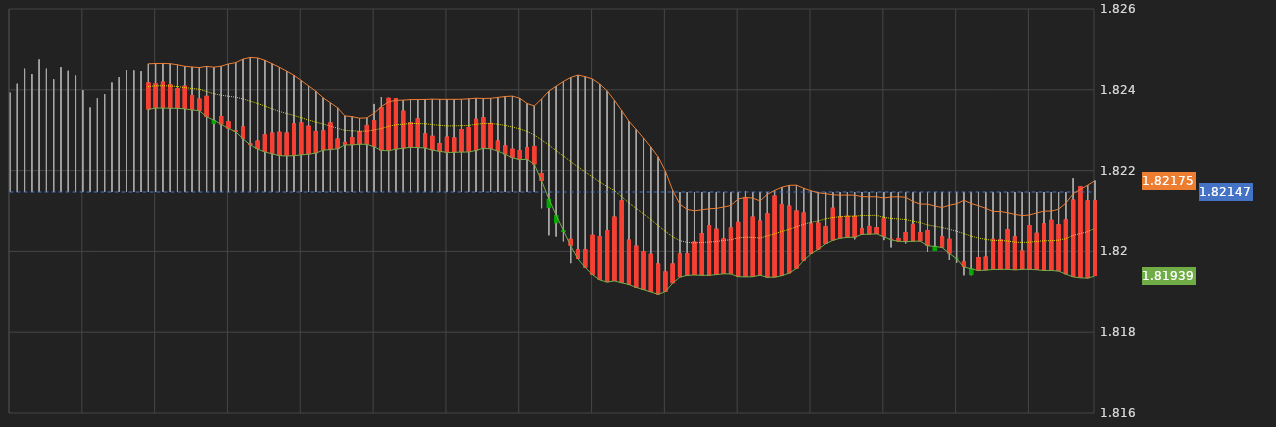
| Category | Series 0 | Series 1 | Series 2 | Series 3 |
|---|---|---|---|---|
| 18/09/2019 10:06:00 | 1.824 | 1.824 | 1.824 | 1.824 |
| 18/09/2019 10:07:00 | 1.824 | 1.824 | 1.824 | 1.824 |
| 18/09/2019 10:08:00 | 1.824 | 1.825 | 1.824 | 1.824 |
| 18/09/2019 10:09:00 | 1.824 | 1.824 | 1.824 | 1.824 |
| 18/09/2019 10:10:00 | 1.824 | 1.825 | 1.824 | 1.824 |
| 18/09/2019 10:11:00 | 1.824 | 1.825 | 1.824 | 1.824 |
| 18/09/2019 10:12:00 | 1.824 | 1.824 | 1.824 | 1.824 |
| 18/09/2019 10:13:00 | 1.824 | 1.825 | 1.824 | 1.824 |
| 18/09/2019 10:14:00 | 1.824 | 1.824 | 1.824 | 1.824 |
| 18/09/2019 10:15:00 | 1.824 | 1.824 | 1.824 | 1.824 |
| 18/09/2019 10:16:00 | 1.824 | 1.824 | 1.823 | 1.823 |
| 18/09/2019 10:17:00 | 1.823 | 1.824 | 1.823 | 1.824 |
| 18/09/2019 10:18:00 | 1.824 | 1.824 | 1.823 | 1.824 |
| 18/09/2019 10:19:00 | 1.824 | 1.824 | 1.823 | 1.824 |
| 18/09/2019 10:20:00 | 1.824 | 1.824 | 1.824 | 1.824 |
| 18/09/2019 10:21:00 | 1.824 | 1.824 | 1.824 | 1.824 |
| 18/09/2019 10:22:00 | 1.824 | 1.824 | 1.824 | 1.824 |
| 18/09/2019 10:23:00 | 1.824 | 1.824 | 1.824 | 1.824 |
| 18/09/2019 10:24:00 | 1.824 | 1.824 | 1.824 | 1.824 |
| 18/09/2019 10:25:00 | 1.824 | 1.824 | 1.824 | 1.824 |
| 18/09/2019 10:26:00 | 1.824 | 1.824 | 1.824 | 1.824 |
| 18/09/2019 10:27:00 | 1.824 | 1.824 | 1.824 | 1.824 |
| 18/09/2019 10:28:00 | 1.824 | 1.824 | 1.824 | 1.824 |
| 18/09/2019 10:29:00 | 1.824 | 1.824 | 1.824 | 1.824 |
| 18/09/2019 10:30:00 | 1.824 | 1.824 | 1.824 | 1.824 |
| 18/09/2019 10:31:00 | 1.824 | 1.824 | 1.824 | 1.824 |
| 18/09/2019 10:32:00 | 1.824 | 1.824 | 1.824 | 1.824 |
| 18/09/2019 10:33:00 | 1.824 | 1.824 | 1.823 | 1.823 |
| 18/09/2019 10:34:00 | 1.823 | 1.823 | 1.823 | 1.823 |
| 18/09/2019 10:35:00 | 1.823 | 1.823 | 1.823 | 1.823 |
| 18/09/2019 10:36:00 | 1.823 | 1.823 | 1.823 | 1.823 |
| 18/09/2019 10:37:00 | 1.823 | 1.823 | 1.823 | 1.823 |
| 18/09/2019 10:38:00 | 1.823 | 1.823 | 1.823 | 1.823 |
| 18/09/2019 10:39:00 | 1.823 | 1.823 | 1.823 | 1.823 |
| 18/09/2019 10:40:00 | 1.823 | 1.823 | 1.823 | 1.823 |
| 18/09/2019 10:41:00 | 1.823 | 1.823 | 1.823 | 1.823 |
| 18/09/2019 10:42:00 | 1.823 | 1.823 | 1.823 | 1.823 |
| 18/09/2019 10:43:00 | 1.823 | 1.823 | 1.823 | 1.823 |
| 18/09/2019 10:44:00 | 1.823 | 1.823 | 1.823 | 1.823 |
| 18/09/2019 10:45:00 | 1.823 | 1.823 | 1.823 | 1.823 |
| 18/09/2019 10:46:00 | 1.823 | 1.823 | 1.823 | 1.823 |
| 18/09/2019 10:47:00 | 1.823 | 1.823 | 1.823 | 1.823 |
| 18/09/2019 10:48:00 | 1.823 | 1.823 | 1.823 | 1.823 |
| 18/09/2019 10:49:00 | 1.823 | 1.823 | 1.823 | 1.823 |
| 18/09/2019 10:50:00 | 1.823 | 1.823 | 1.823 | 1.823 |
| 18/09/2019 10:51:00 | 1.823 | 1.823 | 1.823 | 1.823 |
| 18/09/2019 10:52:00 | 1.823 | 1.823 | 1.823 | 1.823 |
| 18/09/2019 10:53:00 | 1.823 | 1.823 | 1.823 | 1.823 |
| 18/09/2019 10:54:00 | 1.823 | 1.823 | 1.823 | 1.823 |
| 18/09/2019 10:55:00 | 1.823 | 1.823 | 1.823 | 1.823 |
| 18/09/2019 10:56:00 | 1.823 | 1.824 | 1.823 | 1.824 |
| 18/09/2019 10:57:00 | 1.824 | 1.824 | 1.823 | 1.824 |
| 18/09/2019 10:58:00 | 1.824 | 1.824 | 1.824 | 1.824 |
| 18/09/2019 10:59:00 | 1.824 | 1.824 | 1.823 | 1.823 |
| 18/09/2019 11:00:00 | 1.823 | 1.823 | 1.823 | 1.823 |
| 18/09/2019 11:01:00 | 1.823 | 1.823 | 1.823 | 1.823 |
| 18/09/2019 11:02:00 | 1.823 | 1.823 | 1.823 | 1.823 |
| 18/09/2019 11:03:00 | 1.823 | 1.823 | 1.823 | 1.823 |
| 18/09/2019 11:04:00 | 1.823 | 1.823 | 1.823 | 1.823 |
| 18/09/2019 11:05:00 | 1.823 | 1.823 | 1.822 | 1.823 |
| 18/09/2019 11:06:00 | 1.823 | 1.823 | 1.823 | 1.823 |
| 18/09/2019 11:07:00 | 1.823 | 1.823 | 1.823 | 1.823 |
| 18/09/2019 11:08:00 | 1.823 | 1.823 | 1.823 | 1.823 |
| 18/09/2019 11:09:00 | 1.823 | 1.824 | 1.823 | 1.823 |
| 18/09/2019 11:10:00 | 1.823 | 1.823 | 1.823 | 1.823 |
| 18/09/2019 11:11:00 | 1.823 | 1.823 | 1.823 | 1.823 |
| 18/09/2019 11:12:00 | 1.823 | 1.823 | 1.823 | 1.823 |
| 18/09/2019 11:13:00 | 1.823 | 1.823 | 1.823 | 1.823 |
| 18/09/2019 11:14:00 | 1.823 | 1.823 | 1.822 | 1.823 |
| 18/09/2019 11:15:00 | 1.823 | 1.823 | 1.822 | 1.822 |
| 18/09/2019 11:16:00 | 1.823 | 1.823 | 1.822 | 1.823 |
| 18/09/2019 11:17:00 | 1.823 | 1.823 | 1.823 | 1.823 |
| 18/09/2019 11:18:00 | 1.823 | 1.823 | 1.822 | 1.822 |
| 18/09/2019 11:19:00 | 1.822 | 1.822 | 1.821 | 1.821 |
| 18/09/2019 11:20:00 | 1.821 | 1.821 | 1.82 | 1.821 |
| 18/09/2019 11:21:00 | 1.821 | 1.821 | 1.82 | 1.82 |
| 18/09/2019 11:22:00 | 1.82 | 1.821 | 1.82 | 1.82 |
| 18/09/2019 11:23:00 | 1.82 | 1.82 | 1.82 | 1.82 |
| 18/09/2019 11:24:00 | 1.82 | 1.82 | 1.82 | 1.82 |
| 18/09/2019 11:25:00 | 1.82 | 1.82 | 1.82 | 1.82 |
| 18/09/2019 11:26:00 | 1.82 | 1.82 | 1.82 | 1.82 |
| 18/09/2019 11:27:00 | 1.82 | 1.821 | 1.82 | 1.821 |
| 18/09/2019 11:28:00 | 1.821 | 1.821 | 1.82 | 1.821 |
| 18/09/2019 11:29:00 | 1.821 | 1.821 | 1.821 | 1.821 |
| 18/09/2019 11:30:00 | 1.821 | 1.821 | 1.82 | 1.82 |
| 18/09/2019 11:31:00 | 1.82 | 1.82 | 1.82 | 1.82 |
| 18/09/2019 11:32:00 | 1.82 | 1.82 | 1.82 | 1.82 |
| 18/09/2019 11:33:00 | 1.82 | 1.82 | 1.82 | 1.82 |
| 18/09/2019 11:34:00 | 1.82 | 1.82 | 1.82 | 1.82 |
| 18/09/2019 11:35:00 | 1.82 | 1.82 | 1.819 | 1.819 |
| 18/09/2019 11:36:00 | 1.82 | 1.82 | 1.819 | 1.82 |
| 18/09/2019 11:37:00 | 1.82 | 1.82 | 1.82 | 1.82 |
| 18/09/2019 11:38:00 | 1.82 | 1.82 | 1.82 | 1.82 |
| 18/09/2019 11:39:00 | 1.82 | 1.82 | 1.82 | 1.82 |
| 18/09/2019 11:40:00 | 1.82 | 1.821 | 1.82 | 1.82 |
| 18/09/2019 11:41:00 | 1.82 | 1.821 | 1.82 | 1.821 |
| 18/09/2019 11:42:00 | 1.821 | 1.821 | 1.821 | 1.821 |
| 18/09/2019 11:43:00 | 1.821 | 1.821 | 1.82 | 1.82 |
| 18/09/2019 11:44:00 | 1.82 | 1.821 | 1.82 | 1.821 |
| 18/09/2019 11:45:00 | 1.821 | 1.821 | 1.821 | 1.821 |
| 18/09/2019 11:46:00 | 1.821 | 1.821 | 1.821 | 1.821 |
| 18/09/2019 11:47:00 | 1.821 | 1.821 | 1.821 | 1.821 |
| 18/09/2019 11:48:00 | 1.821 | 1.821 | 1.821 | 1.821 |
| 18/09/2019 11:49:00 | 1.821 | 1.821 | 1.821 | 1.821 |
| 18/09/2019 11:50:00 | 1.821 | 1.821 | 1.821 | 1.821 |
| 18/09/2019 11:51:00 | 1.821 | 1.821 | 1.821 | 1.821 |
| 18/09/2019 11:52:00 | 1.821 | 1.821 | 1.821 | 1.821 |
| 18/09/2019 11:53:00 | 1.821 | 1.821 | 1.821 | 1.821 |
| 18/09/2019 11:54:00 | 1.821 | 1.821 | 1.821 | 1.821 |
| 18/09/2019 11:55:00 | 1.821 | 1.821 | 1.82 | 1.821 |
| 18/09/2019 11:56:00 | 1.821 | 1.821 | 1.821 | 1.821 |
| 18/09/2019 11:57:00 | 1.821 | 1.821 | 1.821 | 1.821 |
| 18/09/2019 11:58:00 | 1.821 | 1.821 | 1.821 | 1.821 |
| 18/09/2019 11:59:00 | 1.821 | 1.821 | 1.821 | 1.821 |
| 18/09/2019 12:00:00 | 1.821 | 1.821 | 1.821 | 1.821 |
| 18/09/2019 12:01:00 | 1.821 | 1.821 | 1.821 | 1.821 |
| 18/09/2019 12:02:00 | 1.821 | 1.821 | 1.82 | 1.821 |
| 18/09/2019 12:03:00 | 1.821 | 1.821 | 1.821 | 1.821 |
| 18/09/2019 12:04:00 | 1.821 | 1.821 | 1.821 | 1.821 |
| 18/09/2019 12:05:00 | 1.821 | 1.821 | 1.821 | 1.821 |
| 18/09/2019 12:06:00 | 1.821 | 1.821 | 1.82 | 1.82 |
| 18/09/2019 12:07:00 | 1.82 | 1.82 | 1.82 | 1.82 |
| 18/09/2019 12:08:00 | 1.82 | 1.821 | 1.82 | 1.82 |
| 18/09/2019 12:09:00 | 1.82 | 1.821 | 1.82 | 1.821 |
| 18/09/2019 12:10:00 | 1.821 | 1.821 | 1.82 | 1.82 |
| 18/09/2019 12:11:00 | 1.82 | 1.821 | 1.82 | 1.821 |
| 18/09/2019 12:12:00 | 1.821 | 1.821 | 1.82 | 1.82 |
| 18/09/2019 12:13:00 | 1.82 | 1.82 | 1.82 | 1.82 |
| 18/09/2019 12:14:00 | 1.82 | 1.821 | 1.82 | 1.82 |
| 18/09/2019 12:15:00 | 1.82 | 1.82 | 1.82 | 1.82 |
| 18/09/2019 12:16:00 | 1.82 | 1.82 | 1.82 | 1.82 |
| 18/09/2019 12:17:00 | 1.82 | 1.82 | 1.819 | 1.819 |
| 18/09/2019 12:18:00 | 1.819 | 1.82 | 1.819 | 1.82 |
| 18/09/2019 12:19:00 | 1.82 | 1.82 | 1.82 | 1.82 |
| 18/09/2019 12:20:00 | 1.82 | 1.82 | 1.82 | 1.82 |
| 18/09/2019 12:21:00 | 1.82 | 1.82 | 1.82 | 1.82 |
| 18/09/2019 12:22:00 | 1.82 | 1.821 | 1.82 | 1.821 |
| 18/09/2019 12:23:00 | 1.821 | 1.821 | 1.82 | 1.82 |
| 18/09/2019 12:24:00 | 1.82 | 1.82 | 1.82 | 1.82 |
| 18/09/2019 12:25:00 | 1.82 | 1.821 | 1.82 | 1.821 |
| 18/09/2019 12:26:00 | 1.821 | 1.821 | 1.82 | 1.82 |
| 18/09/2019 12:27:00 | 1.82 | 1.821 | 1.82 | 1.821 |
| 18/09/2019 12:28:00 | 1.821 | 1.821 | 1.821 | 1.821 |
| 18/09/2019 12:29:00 | 1.821 | 1.821 | 1.821 | 1.821 |
| 18/09/2019 12:30:00 | 1.821 | 1.821 | 1.82 | 1.821 |
| 18/09/2019 12:31:00 | 1.821 | 1.821 | 1.821 | 1.821 |
| 18/09/2019 12:32:00 | 1.821 | 1.822 | 1.821 | 1.822 |
| 18/09/2019 12:33:00 | 1.822 | 1.822 | 1.821 | 1.821 |
| 18/09/2019 12:34:00 | 1.821 | 1.822 | 1.821 | 1.821 |
| 18/09/2019 12:35:00 | 1.821 | 1.822 | 1.821 | 1.821 |